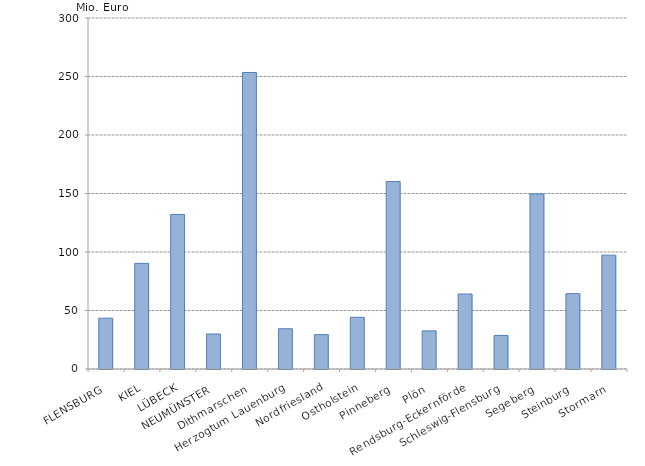
| Category | Series 0 |
|---|---|
| FLENSBURG | 43429.65 |
| KIEL | 90294.89 |
| LÜBECK | 132071.641 |
| NEUMÜNSTER | 29921.375 |
| Dithmarschen | 253442.529 |
| Herzogtum Lauenburg | 34407.41 |
| Nordfriesland | 29356.785 |
| Ostholstein | 44200.872 |
| Pinneberg | 160222.576 |
| Plön | 32596.141 |
| Rendsburg-Eckernförde | 64089.329 |
| Schleswig-Flensburg | 28697.276 |
| Segeberg | 149648.718 |
| Steinburg | 64416.338 |
| Stormarn | 97294.239 |